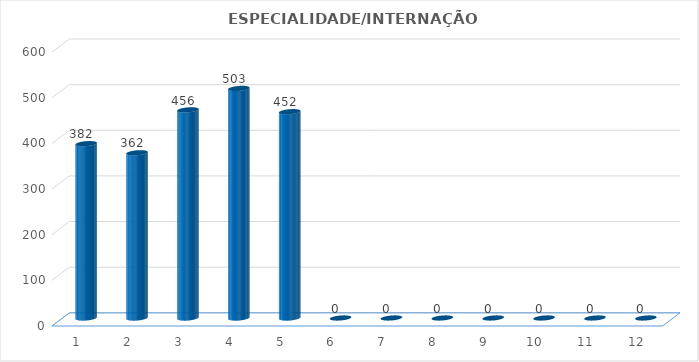
| Category | Series 0 |
|---|---|
| 0 | 382 |
| 1 | 362 |
| 2 | 456 |
| 3 | 503 |
| 4 | 452 |
| 5 | 0 |
| 6 | 0 |
| 7 | 0 |
| 8 | 0 |
| 9 | 0 |
| 10 | 0 |
| 11 | 0 |